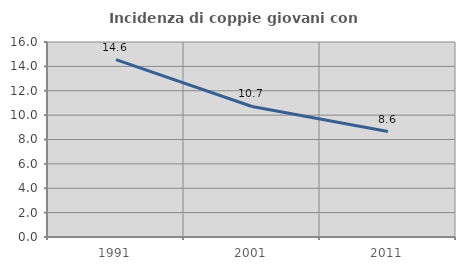
| Category | Incidenza di coppie giovani con figli |
|---|---|
| 1991.0 | 14.555 |
| 2001.0 | 10.71 |
| 2011.0 | 8.649 |